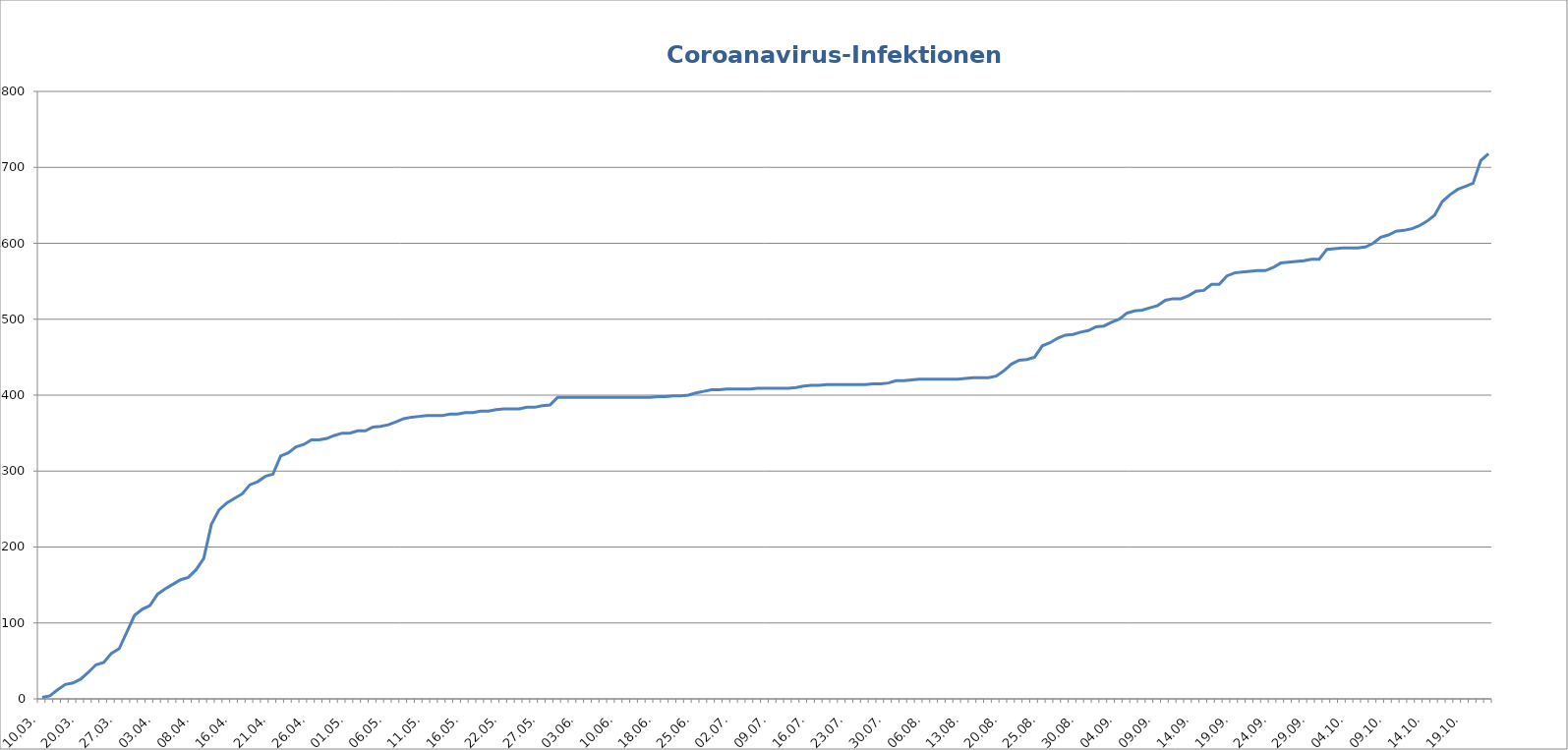
| Category | Infektionen
gesamt |
|---|---|
| 10.03. | 2 |
| 13.03. | 4 |
| 16.03. | 12 |
| 18.03. | 19 |
| 19.03. | 21 |
| 20.03. | 26 |
| 23.03. | 35 |
| 24.03. | 45 |
| 25.03. | 48 |
| 26.03. | 60 |
| 27.03. | 66 |
| 30.03. | 88 |
| 31.03. | 110 |
| 01.04. | 118 |
| 02.04. | 123 |
| 03.04. | 138 |
| 04.04. | 145 |
| 05.04. | 151 |
| 06.04. | 157 |
| 07.04. | 160 |
| 08.04. | 170 |
| 09.04. | 185 |
| 13.04. | 230 |
| 14.04. | 249 |
| 15.04. | 258 |
| 16.04. | 264 |
| 17.04. | 270 |
| 18.04. | 282 |
| 19.04. | 286 |
| 20.04. | 293 |
| 21.04. | 296 |
| 22.04. | 320 |
| 23.04. | 324 |
| 24.04. | 332 |
| 25.04. | 335 |
| 26.04. | 341 |
| 27.04. | 341 |
| 28.04. | 343 |
| 29.04. | 347 |
| 30.04. | 350 |
| 01.05. | 350 |
| 02.05. | 353 |
| 03.05. | 353 |
| 04.05. | 358 |
| 05.05. | 359 |
| 06.05. | 361 |
| 07.05. | 365 |
| 08.05. | 369 |
| 09.05. | 371 |
| 10.05. | 372 |
| 11.05. | 373 |
| 12.05. | 373 |
| 13.05. | 373 |
| 14.05. | 375 |
| 15.05. | 375 |
| 16.05. | 377 |
| 17.05. | 377 |
| 18.05. | 379 |
| 19.05. | 379 |
| 20.05. | 381 |
| 22.05. | 382 |
| 23.05. | 382 |
| 24.05. | 382 |
| 25.05. | 384 |
| 26.05. | 384 |
| 27.05. | 386 |
| 28.05. | 387 |
| 29.05. | 397 |
| 30.05. | 397 |
| 02.06. | 397 |
| 03.06. | 397 |
| 04.06. | 397 |
| 05.06. | 397 |
| 08.06. | 397 |
| 09.06. | 397 |
| 10.06. | 397 |
| 12.06. | 397 |
| 15.06. | 397 |
| 16.06. | 397 |
| 17.06. | 397 |
| 18.06. | 398 |
| 19.06. | 398 |
| 22.06. | 399 |
| 23.06. | 399 |
| 24.06. | 400 |
| 25.06. | 403 |
| 26.06. | 405 |
| 29.06. | 407 |
| 30.06. | 407 |
| 01.07. | 408 |
| 02.07. | 408 |
| 03.07. | 408 |
| 06.07. | 408 |
| 07.07. | 409 |
| 08.07. | 409 |
| 09.07. | 409 |
| 10.07. | 409 |
| 13.07. | 409 |
| 14.07. | 410 |
| 15.07. | 412 |
| 16.07. | 413 |
| 17.07. | 413 |
| 20.07. | 414 |
| 21.07. | 414 |
| 22.07. | 414 |
| 23.07. | 414 |
| 24.07. | 414 |
| 27.07. | 414 |
| 28.07. | 415 |
| 29.07. | 415 |
| 30.07. | 416 |
| 31.07. | 419 |
| 03.08. | 419 |
| 04.08. | 420 |
| 05.08. | 421 |
| 06.08. | 421 |
| 07.08. | 421 |
| 10.08. | 421 |
| 11.08. | 421 |
| 12.08. | 421 |
| 13.08. | 422 |
| 14.08. | 423 |
| 17.08. | 423 |
| 18.08. | 423 |
| 19.08. | 425 |
| 20.08. | 432 |
| 21.08. | 441 |
| 22.08. | 446 |
| 23.08. | 447 |
| 24.08. | 450 |
| 25.08. | 465 |
| 26.08. | 469 |
| 27.08. | 475 |
| 28.08. | 479 |
| 29.08. | 480 |
| 30.08. | 483 |
| 31.08. | 485 |
| 01.09. | 490 |
| 02.09. | 491 |
| 03.09. | 496 |
| 04.09. | 500 |
| 05.09. | 508 |
| 06.09. | 511 |
| 07.09. | 512 |
| 08.09. | 515 |
| 09.09. | 518 |
| 10.09. | 525 |
| 11.09. | 527 |
| 12.09. | 527 |
| 13.09. | 531 |
| 14.09. | 537 |
| 15.09. | 538 |
| 16.09. | 546 |
| 17.09. | 546 |
| 18.09. | 557 |
| 19.09. | 561 |
| 20.09. | 562 |
| 21.09. | 563 |
| 22.09. | 564 |
| 23.o9. | 564 |
| 24.09. | 568 |
| 25.09. | 574 |
| 26.09. | 575 |
| 27.09. | 576 |
| 28.09. | 577 |
| 29.09. | 579 |
| 30.09. | 579 |
| 01.10. | 592 |
| 02.10. | 593 |
| 03.10. | 594 |
| 04.10. | 594 |
| 05.10. | 594 |
| 06.10. | 595 |
| 07.10. | 600 |
| 08.10. | 608 |
| 09.10. | 611 |
| 10.10. | 616 |
| 11.10. | 617 |
| 12.10. | 619 |
| 13.10. | 623 |
| 14.10. | 629 |
| 15.10. | 637 |
| 16.10. | 655 |
| 17.10. | 664 |
| 18.10. | 671 |
| 19.10. | 675 |
| 20.10. | 679 |
| 21.10. | 709 |
| 22.10. | 718 |